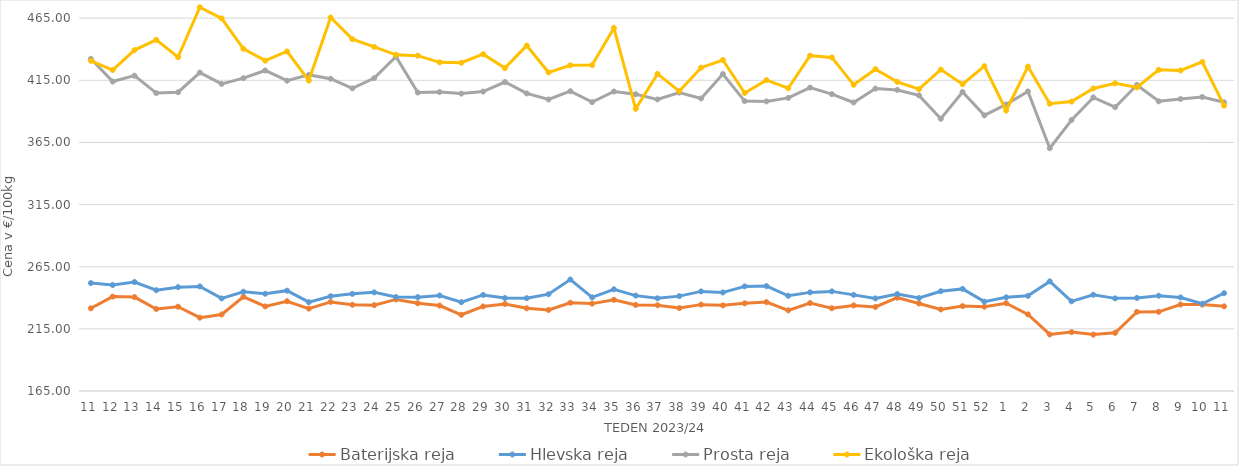
| Category | Baterijska reja | Hlevska reja | Prosta reja | Ekološka reja |
|---|---|---|---|---|
| 11.0 | 231.56 | 251.88 | 432.34 | 430.69 |
| 12.0 | 240.97 | 250.3 | 414 | 423.28 |
| 13.0 | 240.55 | 252.7 | 418.74 | 439.31 |
| 14.0 | 230.99 | 246.12 | 404.72 | 447.59 |
| 15.0 | 232.82 | 248.56 | 405.42 | 433.62 |
| 16.0 | 224 | 249.17 | 421.22 | 473.79 |
| 17.0 | 226.57 | 239.5 | 412.13 | 464.83 |
| 18.0 | 240.83 | 244.89 | 416.74 | 440.35 |
| 19.0 | 233.05 | 243.26 | 422.93 | 430.86 |
| 20.0 | 237.25 | 245.73 | 414.68 | 438.28 |
| 21.0 | 231.3 | 236.5 | 419.36 | 414.83 |
| 22.0 | 236.67 | 241.27 | 416.27 | 465.52 |
| 23.0 | 234.39 | 243.16 | 408.53 | 448.1 |
| 24.0 | 234.08 | 244.37 | 416.78 | 441.9 |
| 25.0 | 238.69 | 240.6 | 434.05 | 435.52 |
| 26.0 | 235.57 | 240.51 | 405.15 | 434.83 |
| 27.0 | 233.75 | 241.89 | 405.58 | 429.48 |
| 28.0 | 226.35 | 236.46 | 404.32 | 429.14 |
| 29.0 | 233.03 | 242.31 | 405.96 | 436.04 |
| 30.0 | 235 | 239.8 | 413.63 | 424.83 |
| 31.0 | 231.55 | 239.67 | 404.46 | 442.93 |
| 32.0 | 230.2 | 242.89 | 399.57 | 421.38 |
| 33.0 | 236.04 | 254.68 | 406.23 | 427.07 |
| 34.0 | 235.32 | 240.35 | 397.45 | 427.24 |
| 35.0 | 238.39 | 246.82 | 406 | 457.07 |
| 36.0 | 234.27 | 241.75 | 403.79 | 392.07 |
| 37.0 | 234 | 239.58 | 399.61 | 420.17 |
| 38.0 | 231.74 | 241.34 | 405.14 | 406.21 |
| 39.0 | 234.5 | 245.15 | 400.39 | 425.17 |
| 40.0 | 233.92 | 244.29 | 420.04 | 431.38 |
| 41.0 | 235.54 | 249.18 | 398.28 | 404.83 |
| 42.0 | 236.54 | 249.42 | 398.03 | 415.17 |
| 43.0 | 229.92 | 241.62 | 400.86 | 408.62 |
| 44.0 | 235.77 | 244.36 | 409.1 | 434.83 |
| 45.0 | 231.6 | 245.16 | 403.86 | 433.45 |
| 46.0 | 233.89 | 242.36 | 397.17 | 411.38 |
| 47.0 | 232.62 | 239.48 | 408.34 | 423.97 |
| 48.0 | 240.11 | 243.04 | 407.25 | 413.79 |
| 49.0 | 235.41 | 239.81 | 402.87 | 407.93 |
| 50.0 | 230.65 | 245.3 | 384.02 | 423.62 |
| 51.0 | 233.3 | 247.16 | 405.6 | 411.9 |
| 52.0 | 232.85 | 236.91 | 386.82 | 426.38 |
| 1.0 | 235.66 | 240.38 | 395.59 | 390.69 |
| 2.0 | 226.65 | 241.59 | 406.11 | 426.03 |
| 3.0 | 210.5 | 253.21 | 360.35 | 396.21 |
| 4.0 | 212.37 | 237.14 | 383.09 | 397.93 |
| 5.0 | 210.38 | 242.47 | 401.23 | 408.45 |
| 6.0 | 211.82 | 239.54 | 393.39 | 412.59 |
| 7.0 | 228.66 | 239.86 | 411.29 | 409.31 |
| 8.0 | 228.73 | 241.68 | 398.12 | 423.45 |
| 9.0 | 234.57 | 240.29 | 399.93 | 422.93 |
| 10.0 | 234.52 | 235.22 | 401.58 | 429.83 |
| 11.0 | 233.13 | 243.7 | 397.29 | 394.66 |